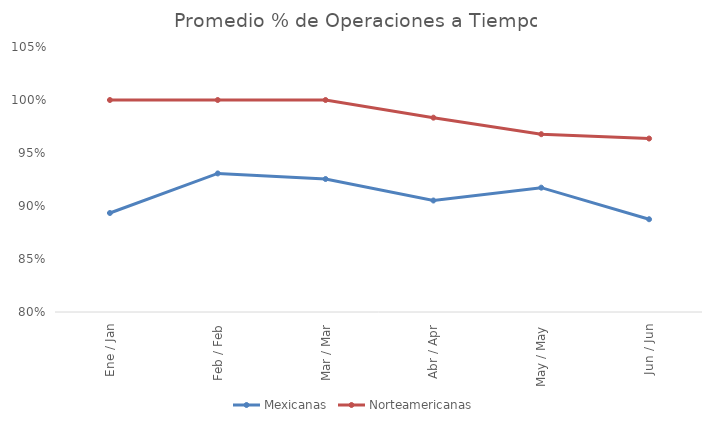
| Category | Mexicanas | Norteamericanas |
|---|---|---|
| Ene / Jan | 0.893 | 1 |
| Feb / Feb | 0.931 | 1 |
| Mar / Mar | 0.925 | 1 |
| Abr / Apr | 0.905 | 0.983 |
| May / May | 0.917 | 0.968 |
| Jun / Jun | 0.888 | 0.964 |